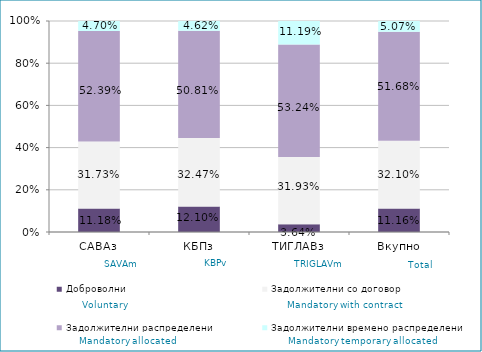
| Category | Доброволни  | Задолжителни со договор  | Задолжителни распределени  | Задолжителни времено распределени  |
|---|---|---|---|---|
| САВАз | 0.112 | 0.317 | 0.524 | 0.047 |
| КБПз | 0.121 | 0.325 | 0.508 | 0.046 |
| ТИГЛАВз | 0.036 | 0.319 | 0.532 | 0.112 |
| Вкупно | 0.112 | 0.321 | 0.517 | 0.051 |